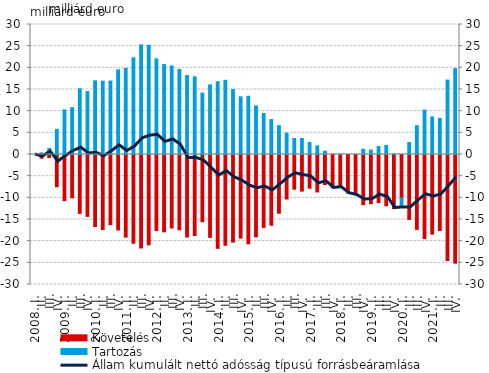
| Category | Követelés | Tartozás |
|---|---|---|
| 2008. I. | 0 | 0 |
|          II. | -0.851 | 0.372 |
|          III. | -0.698 | 1.388 |
|          IV. | -7.444 | 5.798 |
| 2009. I. | -10.651 | 10.301 |
|          II. | -9.986 | 10.798 |
|          III. | -13.594 | 15.17 |
|          IV. | -14.283 | 14.52 |
| 2010. I. | -16.613 | 17.005 |
|          II. | -17.314 | 16.929 |
|          III. | -16.185 | 16.948 |
|          IV. | -17.416 | 19.527 |
| 2011. I. | -19.061 | 19.849 |
|          II. | -20.485 | 22.309 |
|          III. | -21.575 | 25.301 |
|          IV. | -20.841 | 25.195 |
| 2012. I. | -17.539 | 22.066 |
|          II. | -17.847 | 20.761 |
|          III. | -16.951 | 20.433 |
|          IV. | -17.379 | 19.629 |
| 2013. I. | -19.043 | 18.207 |
| II. | -18.703 | 17.929 |
|          III. | -15.515 | 14.165 |
| IV. | -19.124 | 16.074 |
| 2014. I. | -21.656 | 16.791 |
| II. | -20.959 | 17.124 |
|          III. | -20.221 | 14.972 |
| IV. | -19.295 | 13.303 |
| 2015. I. | -20.605 | 13.44 |
| II. | -19.008 | 11.22 |
|          III. | -16.826 | 9.454 |
| IV. | -16.33 | 8.051 |
| 2016. I. | -13.559 | 6.668 |
| II. | -10.267 | 4.929 |
|          III. | -8.014 | 3.69 |
| IV. | -8.453 | 3.701 |
| 2017. I. | -7.794 | 2.764 |
| II. | -8.643 | 1.985 |
|          III. | -6.917 | 0.76 |
| IV. | -7.651 | -0.06 |
| 2018. I. | -7.579 | 0.052 |
| II. | -8.44 | -0.488 |
|          III. | -8.984 | -0.342 |
| IV. | -11.578 | 1.207 |
| 2019. I. | -11.357 | 1.031 |
| II. | -11.069 | 1.815 |
| III. | -11.839 | 2.081 |
| IV. | -12.488 | 0.146 |
| 2020. I. | -10.036 | -2.177 |
| II. | -14.977 | 2.772 |
| III. | -17.286 | 6.651 |
| IV. | -19.426 | 10.257 |
| 2021. I. | -18.368 | 8.678 |
| II. | -17.543 | 8.329 |
| III. | -24.47 | 17.175 |
| IV. | -25.073 | 19.815 |